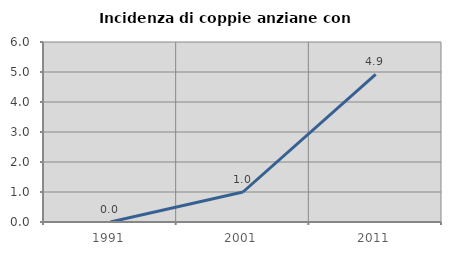
| Category | Incidenza di coppie anziane con figli |
|---|---|
| 1991.0 | 0 |
| 2001.0 | 1 |
| 2011.0 | 4.918 |